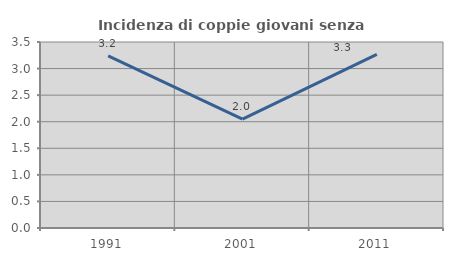
| Category | Incidenza di coppie giovani senza figli |
|---|---|
| 1991.0 | 3.239 |
| 2001.0 | 2.049 |
| 2011.0 | 3.265 |